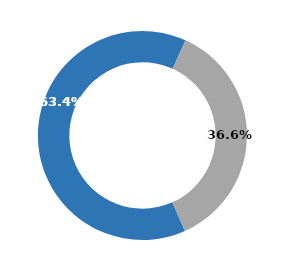
| Category | Series 1 | Series 0 | Series 2 |
|---|---|---|---|
| Promotors |  |  | 0.634 |
| Free Float |  |  | 0.366 |